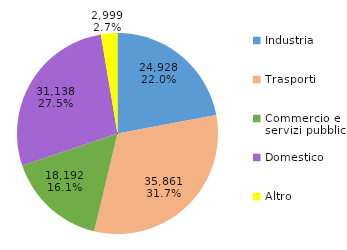
| Category | Series 0 |
|---|---|
| Industria | 24928.486 |
| Trasporti | 35861.202 |
| Commercio e servizi pubblici | 18192.3 |
| Domestico | 31138.335 |
| Altro | 2999.151 |